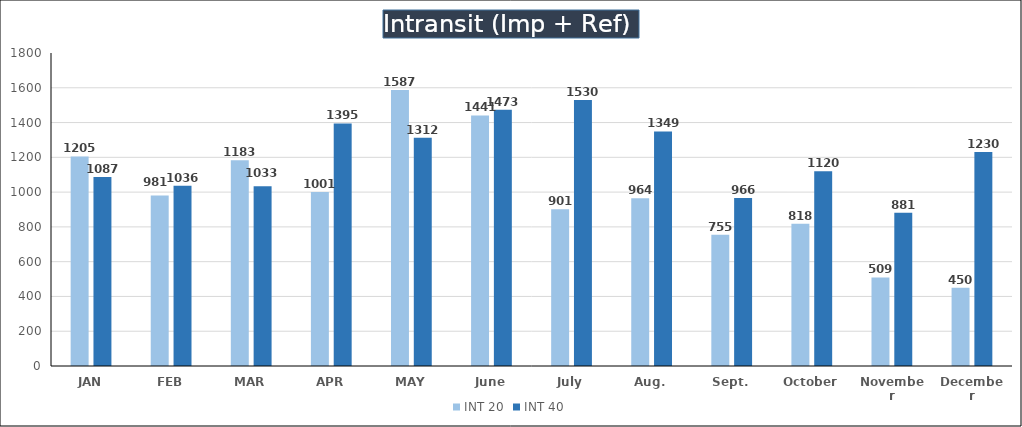
| Category | INT 20 | INT 40 |
|---|---|---|
| JAN | 1205 | 1087 |
| FEB | 981 | 1036 |
| MAR | 1183 | 1033 |
| APR | 1001 | 1395 |
| MAY | 1587 | 1312 |
| June | 1441 | 1473 |
| July | 901 | 1530 |
| Aug. | 964 | 1349 |
| Sept. | 755 | 966 |
| October | 818 | 1120 |
| November | 509 | 881 |
| December | 450 | 1230 |